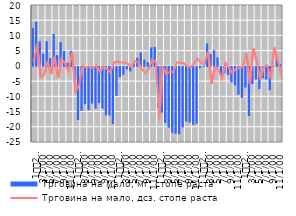
| Category | Трговина на мало, мг. стопе раста |
|---|---|
| 1
2008. | 12.467 |
| 2 | 14.563 |
| 3 | 8.049 |
| 4 | 3.982 |
| 5 | 8.099 |
| 6 | 2.563 |
| 7 | 10.47 |
| 8 | 3.531 |
| 9 | 7.844 |
| 10 | 4.964 |
| 11 | 1 |
| 12 | 4.977 |
| 1
2009. | -4.463 |
| 2 | -17.483 |
| 3 | -14.451 |
| 4 | -12.238 |
| 5 | -14.184 |
| 6 | -12.074 |
| 7 | -13.771 |
| 8 | -11.9 |
| 9 | -13.712 |
| 10 | -15.91 |
| 11 | -15.943 |
| 12 | -18.812 |
| 1
2010. | -9.539 |
| 2 | -3.357 |
| 3 | -2.603 |
| 4 | -0.788 |
| 5 | -1.485 |
| 6 | 1.212 |
| 7 | 2.685 |
| 8 | 4.479 |
| 9 | 2.045 |
| 10 | 1.233 |
| 11 | 6.073 |
| 12 | 6.203 |
| 1
2011. | -13.604 |
| 2 | -15.053 |
| 3 | -18.413 |
| 4 | -19.972 |
| 5 | -21.669 |
| 6 | -21.976 |
| 7 | -22.132 |
| 8 | -19.883 |
| 9 | -17.972 |
| 10 | -18.304 |
| 11 | -19.02 |
| 12 | -18.668 |
| 1
2012. | -0.338 |
| 2 | 0.117 |
| 3 | 7.381 |
| 4 | 3.884 |
| 5 | 5.149 |
| 6 | 2.772 |
| 7 | -2.791 |
| 8 | -1.961 |
| 9 | -2.614 |
| 10 | -5.064 |
| 11 | -6.067 |
| 12 | -9.17 |
| 1
2013. | -10.137 |
| 2 | -6.792 |
| 3 | -16.102 |
| 4 | -5.657 |
| 5 | -4.114 |
| 6 | -7.293 |
| 7 | -3.663 |
| 8 | -4.095 |
| 9 | -7.67 |
| 10 | 0.097 |
| 11 | 3.063 |
| 12 | 0.577 |